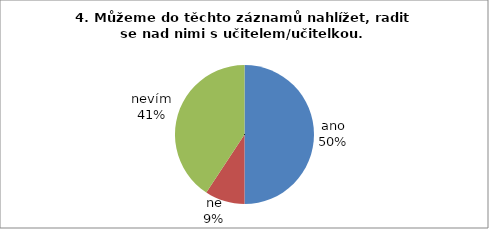
| Category | 4. |
|---|---|
| ano | 27 |
| ne | 5 |
| nevím | 22 |